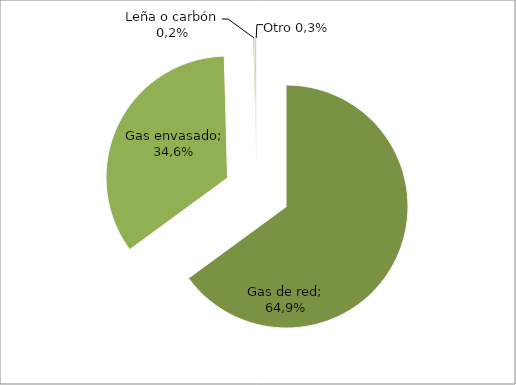
| Category | Series 0 |
|---|---|
| Gas de red | 64.916 |
| Gas envasado | 34.621 |
| Leña o carbón | 0.156 |
| Otro | 0.266 |